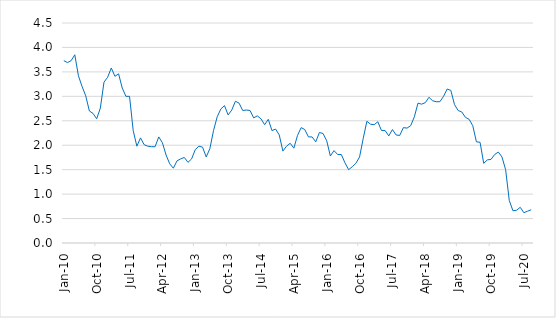
| Category | Series 0 |
|---|---|
| 2010-01-01 | 3.73 |
| 2010-02-01 | 3.69 |
| 2010-03-01 | 3.73 |
| 2010-04-01 | 3.85 |
| 2010-05-01 | 3.42 |
| 2010-06-01 | 3.2 |
| 2010-07-01 | 3.01 |
| 2010-08-01 | 2.7 |
| 2010-09-01 | 2.65 |
| 2010-10-01 | 2.54 |
| 2010-11-01 | 2.76 |
| 2010-12-01 | 3.29 |
| 2011-01-01 | 3.39 |
| 2011-02-01 | 3.58 |
| 2011-03-01 | 3.41 |
| 2011-04-01 | 3.46 |
| 2011-05-01 | 3.17 |
| 2011-06-01 | 3 |
| 2011-07-01 | 3 |
| 2011-08-01 | 2.3 |
| 2011-09-01 | 1.98 |
| 2011-10-01 | 2.15 |
| 2011-11-01 | 2.01 |
| 2011-12-01 | 1.98 |
| 2012-01-01 | 1.97 |
| 2012-02-01 | 1.97 |
| 2012-03-01 | 2.17 |
| 2012-04-01 | 2.05 |
| 2012-05-01 | 1.8 |
| 2012-06-01 | 1.62 |
| 2012-07-01 | 1.53 |
| 2012-08-01 | 1.68 |
| 2012-09-01 | 1.72 |
| 2012-10-01 | 1.75 |
| 2012-11-01 | 1.65 |
| 2012-12-01 | 1.72 |
| 2013-01-01 | 1.91 |
| 2013-02-01 | 1.98 |
| 2013-03-01 | 1.96 |
| 2013-04-01 | 1.76 |
| 2013-05-01 | 1.93 |
| 2013-06-01 | 2.3 |
| 2013-07-01 | 2.58 |
| 2013-08-01 | 2.74 |
| 2013-09-01 | 2.81 |
| 2013-10-01 | 2.62 |
| 2013-11-01 | 2.72 |
| 2013-12-01 | 2.9 |
| 2014-01-01 | 2.86 |
| 2014-02-01 | 2.71 |
| 2014-03-01 | 2.72 |
| 2014-04-01 | 2.71 |
| 2014-05-01 | 2.56 |
| 2014-06-01 | 2.6 |
| 2014-07-01 | 2.54 |
| 2014-08-01 | 2.42 |
| 2014-09-01 | 2.53 |
| 2014-10-01 | 2.3 |
| 2014-11-01 | 2.33 |
| 2014-12-01 | 2.21 |
| 2015-01-01 | 1.88 |
| 2015-02-01 | 1.98 |
| 2015-03-01 | 2.04 |
| 2015-04-01 | 1.94 |
| 2015-05-01 | 2.2 |
| 2015-06-01 | 2.36 |
| 2015-07-01 | 2.32 |
| 2015-08-01 | 2.17 |
| 2015-09-01 | 2.17 |
| 2015-10-01 | 2.07 |
| 2015-11-01 | 2.26 |
| 2015-12-01 | 2.24 |
| 2016-01-01 | 2.09 |
| 2016-02-01 | 1.78 |
| 2016-03-01 | 1.89 |
| 2016-04-01 | 1.81 |
| 2016-05-01 | 1.81 |
| 2016-06-01 | 1.64 |
| 2016-07-01 | 1.5 |
| 2016-08-01 | 1.56 |
| 2016-09-01 | 1.63 |
| 2016-10-01 | 1.76 |
| 2016-11-01 | 2.14 |
| 2016-12-01 | 2.49 |
| 2017-01-01 | 2.43 |
| 2017-02-01 | 2.42 |
| 2017-03-01 | 2.48 |
| 2017-04-01 | 2.3 |
| 2017-05-01 | 2.3 |
| 2017-06-01 | 2.19 |
| 2017-07-01 | 2.32 |
| 2017-08-01 | 2.21 |
| 2017-09-01 | 2.2 |
| 2017-10-01 | 2.36 |
| 2017-11-01 | 2.35 |
| 2017-12-01 | 2.4 |
| 2018-01-01 | 2.58 |
| 2018-02-01 | 2.86 |
| 2018-03-01 | 2.84 |
| 2018-04-01 | 2.87 |
| 2018-05-01 | 2.98 |
| 2018-06-01 | 2.91 |
| 2018-07-01 | 2.89 |
| 2018-08-01 | 2.89 |
| 2018-09-01 | 3 |
| 2018-10-01 | 3.15 |
| 2018-11-01 | 3.12 |
| 2018-12-01 | 2.83 |
| 2019-01-01 | 2.71 |
| 2019-02-01 | 2.68 |
| 2019-03-01 | 2.57 |
| 2019-04-01 | 2.53 |
| 2019-05-01 | 2.4 |
| 2019-06-01 | 2.07 |
| 2019-07-01 | 2.06 |
| 2019-08-01 | 1.63 |
| 2019-09-01 | 1.7 |
| 2019-10-01 | 1.71 |
| 2019-11-01 | 1.81 |
| 2019-12-01 | 1.86 |
| 2020-01-01 | 1.76 |
| 2020-02-01 | 1.5 |
| 2020-03-01 | 0.87 |
| 2020-04-01 | 0.66 |
| 2020-05-01 | 0.67 |
| 2020-06-01 | 0.73 |
| 2020-07-01 | 0.62 |
| 2020-08-01 | 0.65 |
| 2020-09-01 | 0.68 |